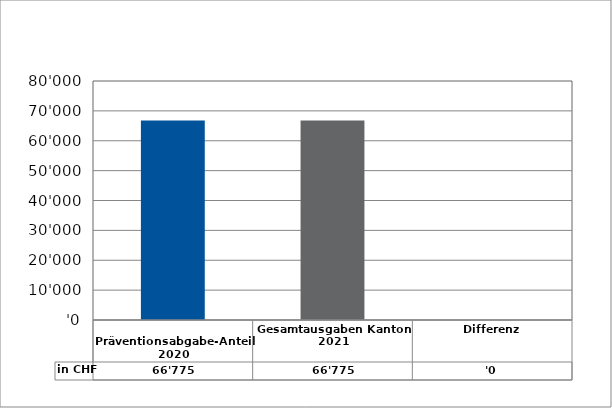
| Category | in CHF |
|---|---|
| 
Präventionsabgabe-Anteil 2020

 | 66775 |
| Gesamtausgaben Kanton 2021
 | 66775 |
| Differenz | 0 |